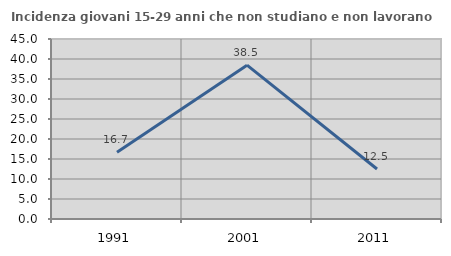
| Category | Incidenza giovani 15-29 anni che non studiano e non lavorano  |
|---|---|
| 1991.0 | 16.716 |
| 2001.0 | 38.462 |
| 2011.0 | 12.5 |